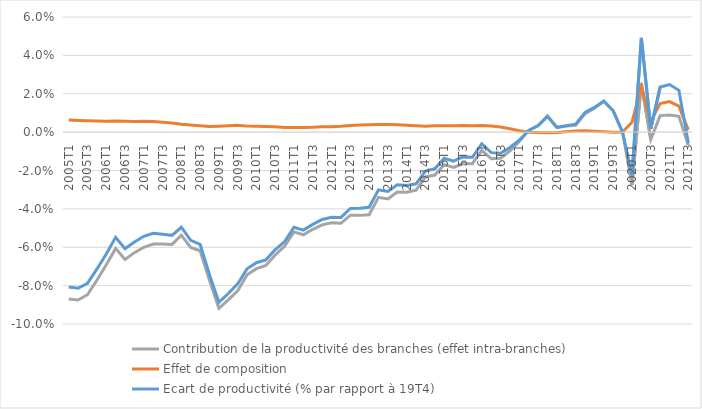
| Category | Contribution de la productivité des branches (effet intra-branches) | Effet de composition | Ecart de productivité (% par rapport à 19T4) |
|---|---|---|---|
| 2005T1 | -0.087 | 0.006 | -0.081 |
| 2005T2 | -0.088 | 0.006 | -0.081 |
| 2005T3 | -0.085 | 0.006 | -0.079 |
| 2005T4 | -0.077 | 0.006 | -0.071 |
| 2006T1 | -0.069 | 0.006 | -0.064 |
| 2006T2 | -0.061 | 0.006 | -0.055 |
| 2006T3 | -0.066 | 0.006 | -0.061 |
| 2006T4 | -0.063 | 0.006 | -0.057 |
| 2007T1 | -0.06 | 0.006 | -0.054 |
| 2007T2 | -0.058 | 0.006 | -0.053 |
| 2007T3 | -0.058 | 0.005 | -0.053 |
| 2007T4 | -0.059 | 0.005 | -0.054 |
| 2008T1 | -0.054 | 0.004 | -0.05 |
| 2008T2 | -0.06 | 0.004 | -0.056 |
| 2008T3 | -0.062 | 0.003 | -0.058 |
| 2008T4 | -0.077 | 0.003 | -0.074 |
| 2009T1 | -0.092 | 0.003 | -0.089 |
| 2009T2 | -0.087 | 0.003 | -0.084 |
| 2009T3 | -0.083 | 0.004 | -0.079 |
| 2009T4 | -0.074 | 0.003 | -0.071 |
| 2010T1 | -0.071 | 0.003 | -0.068 |
| 2010T2 | -0.069 | 0.003 | -0.067 |
| 2010T3 | -0.064 | 0.003 | -0.061 |
| 2010T4 | -0.059 | 0.002 | -0.057 |
| 2011T1 | -0.052 | 0.002 | -0.05 |
| 2011T2 | -0.054 | 0.002 | -0.051 |
| 2011T3 | -0.051 | 0.003 | -0.048 |
| 2011T4 | -0.048 | 0.003 | -0.046 |
| 2012T1 | -0.047 | 0.003 | -0.044 |
| 2012T2 | -0.048 | 0.003 | -0.044 |
| 2012T3 | -0.043 | 0.003 | -0.04 |
| 2012T4 | -0.043 | 0.004 | -0.04 |
| 2013T1 | -0.043 | 0.004 | -0.039 |
| 2013T2 | -0.034 | 0.004 | -0.03 |
| 2013T3 | -0.035 | 0.004 | -0.031 |
| 2013T4 | -0.031 | 0.004 | -0.027 |
| 2014T1 | -0.031 | 0.004 | -0.028 |
| 2014T2 | -0.03 | 0.003 | -0.027 |
| 2014T3 | -0.023 | 0.003 | -0.02 |
| 2014T4 | -0.022 | 0.003 | -0.019 |
| 2015T1 | -0.017 | 0.003 | -0.014 |
| 2015T2 | -0.018 | 0.003 | -0.015 |
| 2015T3 | -0.016 | 0.003 | -0.013 |
| 2015T4 | -0.016 | 0.003 | -0.013 |
| 2016T1 | -0.01 | 0.004 | -0.006 |
| 2016T2 | -0.014 | 0.003 | -0.011 |
| 2016T3 | -0.014 | 0.003 | -0.011 |
| 2016T4 | -0.01 | 0.002 | -0.008 |
| 2017T1 | -0.005 | 0.001 | -0.004 |
| 2017T2 | 0.001 | 0 | 0.001 |
| 2017T3 | 0.004 | 0 | 0.003 |
| 2017T4 | 0.008 | 0 | 0.008 |
| 2018T1 | 0.003 | 0 | 0.002 |
| 2018T2 | 0.003 | 0 | 0.003 |
| 2018T3 | 0.004 | 0.001 | 0.004 |
| 2018T4 | 0.01 | 0.001 | 0.01 |
| 2019T1 | 0.012 | 0 | 0.013 |
| 2019T2 | 0.016 | 0 | 0.016 |
| 2019T3 | 0.011 | 0 | 0.011 |
| 2019T4 | 0 | 0 | 0 |
| 2020T1 | -0.028 | 0.005 | -0.022 |
| 2020T2 | 0.026 | 0.024 | 0.049 |
| 2020T3 | -0.004 | 0.006 | 0.002 |
| 2020T4 | 0.009 | 0.015 | 0.023 |
| 2021T1 | 0.009 | 0.016 | 0.025 |
| 2021T2 | 0.008 | 0.014 | 0.022 |
| 2021T3 | -0.007 | 0.001 | -0.006 |